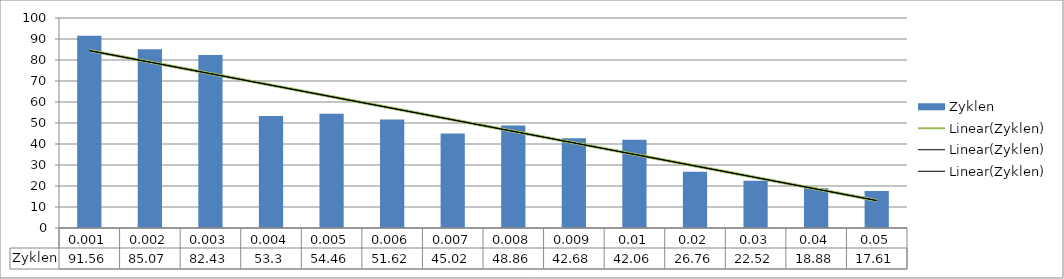
| Category | Zyklen |
|---|---|
| 0.001 | 91.56 |
| 0.002 | 85.07 |
| 0.003 | 82.43 |
| 0.004 | 53.3 |
| 0.005 | 54.46 |
| 0.006 | 51.62 |
| 0.007 | 45.02 |
| 0.008 | 48.86 |
| 0.009 | 42.68 |
| 0.01 | 42.06 |
| 0.02 | 26.76 |
| 0.03 | 22.52 |
| 0.04 | 18.88 |
| 0.05 | 17.61 |